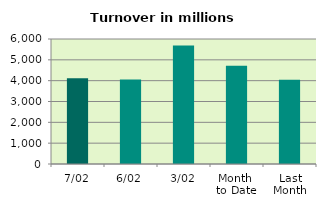
| Category | Series 0 |
|---|---|
| 7/02 | 4111.484 |
| 6/02 | 4054.2 |
| 3/02 | 5688.169 |
| Month 
to Date | 4717.79 |
| Last
Month | 4043.095 |